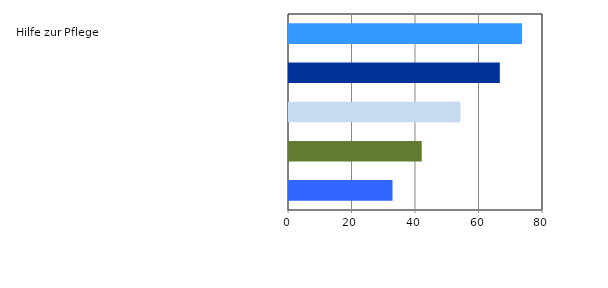
| Category | Series 0 |
|---|---|
| Eingliederungshilfe | 32.6 |
| Leistungen insgesamt | 41.8 |
| Hilfe z.Überw. Bes.Schwierigk. | 54 |
| Hilfe z. Gesundheit | 66.4 |
| Hilfe zur Pflege | 73.4 |